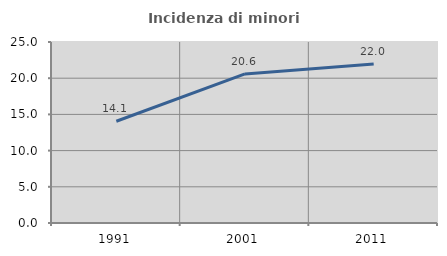
| Category | Incidenza di minori stranieri |
|---|---|
| 1991.0 | 14.054 |
| 2001.0 | 20.588 |
| 2011.0 | 21.978 |